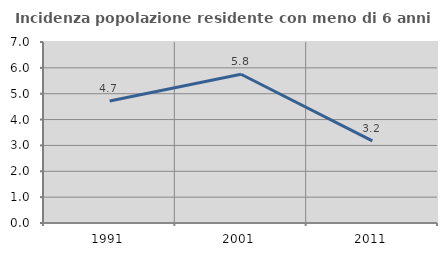
| Category | Incidenza popolazione residente con meno di 6 anni |
|---|---|
| 1991.0 | 4.72 |
| 2001.0 | 5.752 |
| 2011.0 | 3.173 |